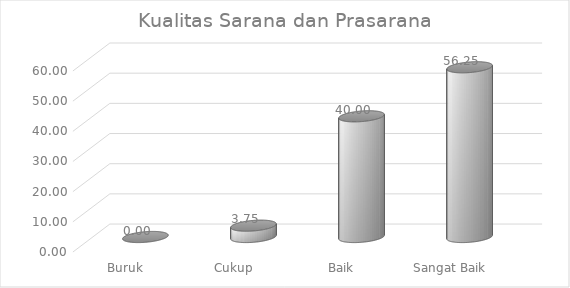
| Category | Penanganan Pengaduan |
|---|---|
| Buruk | 0 |
| Cukup | 3.75 |
| Baik | 40 |
| Sangat Baik | 56.25 |